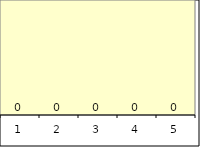
| Category | Series 1 |
|---|---|
| 0 | 0 |
| 1 | 0 |
| 2 | 0 |
| 3 | 0 |
| 4 | 0 |